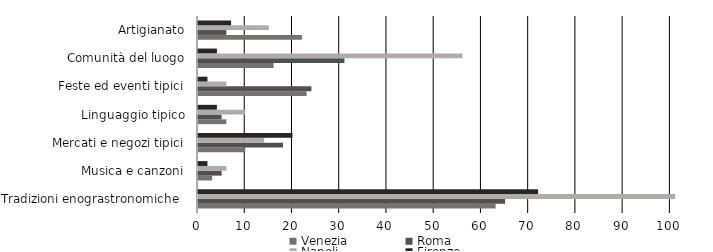
| Category | Venezia | Roma | Napoli | Firenze |
|---|---|---|---|---|
| Tradizioni enograstronomiche  | 63 | 65 | 101 | 72 |
| Musica e canzoni | 3 | 5 | 6 | 2 |
| Mercati e negozi tipici | 10 | 18 | 14 | 20 |
| Linguaggio tipico | 6 | 5 | 10 | 4 |
| Feste ed eventi tipici | 23 | 24 | 6 | 2 |
| Comunità del luogo | 16 | 31 | 56 | 4 |
| Artigianato | 22 | 6 | 15 | 7 |